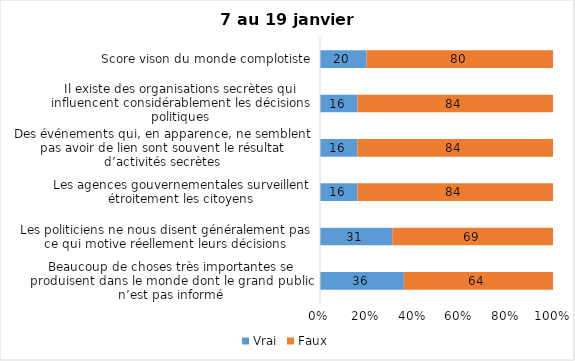
| Category | Vrai | Faux |
|---|---|---|
| Beaucoup de choses très importantes se produisent dans le monde dont le grand public n’est pas informé | 36 | 64 |
| Les politiciens ne nous disent généralement pas ce qui motive réellement leurs décisions | 31 | 69 |
| Les agences gouvernementales surveillent étroitement les citoyens | 16 | 84 |
| Des événements qui, en apparence, ne semblent pas avoir de lien sont souvent le résultat d’activités secrètes | 16 | 84 |
| Il existe des organisations secrètes qui influencent considérablement les décisions politiques | 16 | 84 |
| Score vison du monde complotiste | 20 | 80 |